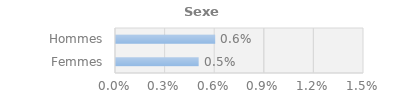
| Category | Series 0 |
|---|---|
| Femmes | 0.005 |
| Hommes | 0.006 |